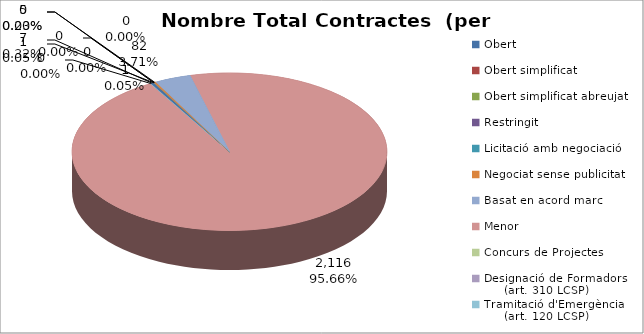
| Category | Nombre Total Contractes |
|---|---|
| Obert | 7 |
| Obert simplificat | 1 |
| Obert simplificat abreujat | 0 |
| Restringit | 0 |
| Licitació amb negociació | 0 |
| Negociat sense publicitat | 5 |
| Basat en acord marc | 82 |
| Menor | 2116 |
| Concurs de Projectes | 1 |
| Designació de Formadors
     (art. 310 LCSP) | 0 |
| Tramitació d'Emergència
     (art. 120 LCSP) | 0 |